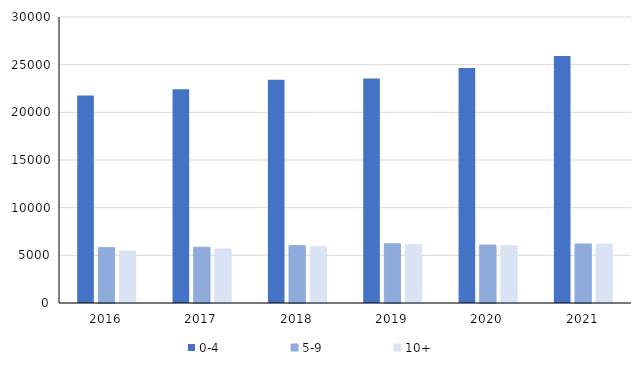
| Category | 0-4 | 5-9 | 10+ |
|---|---|---|---|
| 2016.0 | 21762 | 5807 | 5437 |
| 2017.0 | 22420 | 5852 | 5677 |
| 2018.0 | 23407 | 6017 | 5902 |
| 2019.0 | 23542 | 6209 | 6136 |
| 2020.0 | 24650 | 6082 | 6013 |
| 2021.0 | 25906 | 6192 | 6186 |